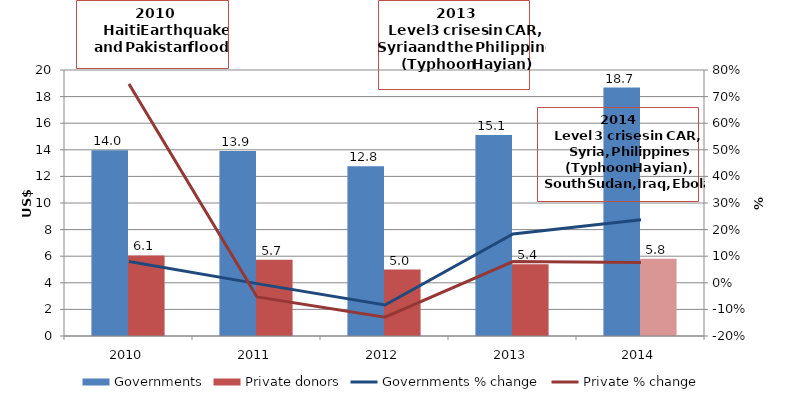
| Category | Governments | Private donors |
|---|---|---|
| 2010.0 | 13.962 | 6.059 |
| 2011.0 | 13.917 | 5.738 |
| 2012.0 | 12.758 | 4.998 |
| 2013.0 | 15.104 | 5.398 |
| 2014.0 | 18.68 | 5.81 |